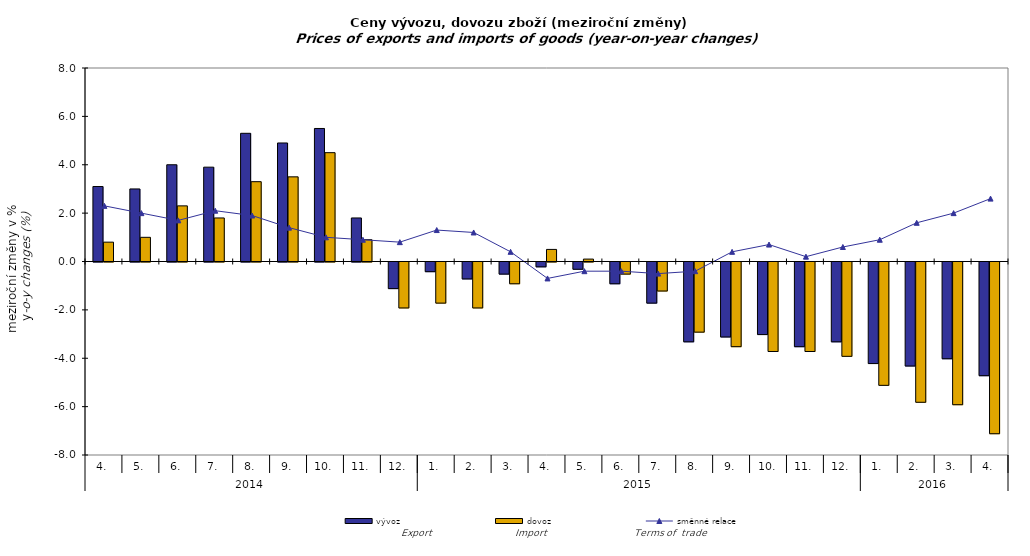
| Category | vývoz | dovoz |
|---|---|---|
| 0 | 3.1 | 0.8 |
| 1 | 3 | 1 |
| 2 | 4 | 2.3 |
| 3 | 3.9 | 1.8 |
| 4 | 5.3 | 3.3 |
| 5 | 4.9 | 3.5 |
| 6 | 5.5 | 4.5 |
| 7 | 1.8 | 0.9 |
| 8 | -1.1 | -1.9 |
| 9 | -0.4 | -1.7 |
| 10 | -0.7 | -1.9 |
| 11 | -0.5 | -0.9 |
| 12 | -0.2 | 0.5 |
| 13 | -0.3 | 0.1 |
| 14 | -0.9 | -0.5 |
| 15 | -1.7 | -1.2 |
| 16 | -3.3 | -2.9 |
| 17 | -3.1 | -3.5 |
| 18 | -3 | -3.7 |
| 19 | -3.5 | -3.7 |
| 20 | -3.3 | -3.9 |
| 21 | -4.2 | -5.1 |
| 22 | -4.3 | -5.8 |
| 23 | -4 | -5.9 |
| 24 | -4.7 | -7.1 |